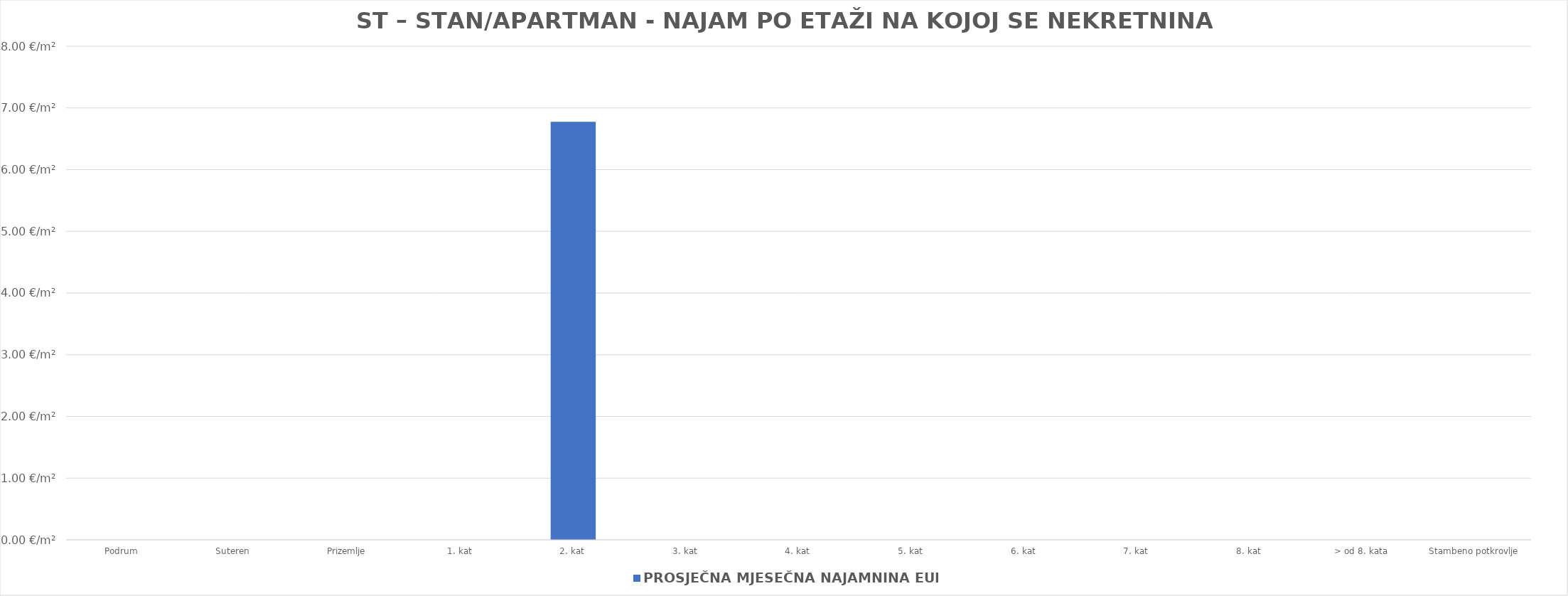
| Category | PROSJEČNA MJESEČNA NAJAMNINA EUR/m² |
|---|---|
| Podrum | 0 |
| Suteren  | 0 |
| Prizemlje | 0 |
| 1. kat | 0 |
| 2. kat | 1900-01-06 18:36:05 |
| 3. kat | 0 |
| 4. kat | 0 |
| 5. kat | 0 |
| 6. kat | 0 |
| 7. kat | 0 |
| 8. kat | 0 |
| > od 8. kata | 0 |
| Stambeno potkrovlje | 0 |